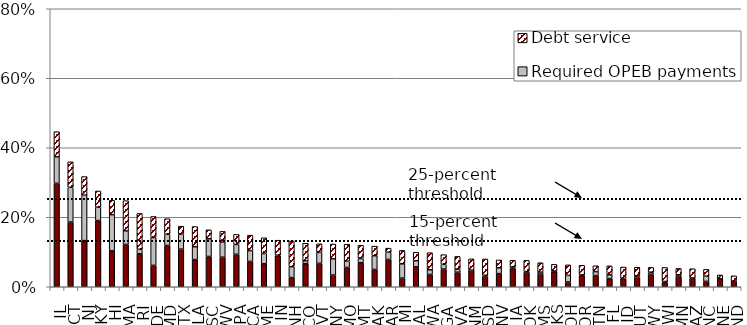
| Category | Required pension payments | Required OPEB payments | Debt service |
|---|---|---|---|
| IL | 0.298 | 0.076 | 0.073 |
| CT | 0.186 | 0.1 | 0.074 |
| NJ | 0.133 | 0.131 | 0.054 |
| KY | 0.19 | 0.039 | 0.047 |
| HI | 0.104 | 0.104 | 0.041 |
| MA | 0.122 | 0.039 | 0.087 |
| RI | 0.095 | 0.013 | 0.103 |
| DE | 0.062 | 0.08 | 0.061 |
| MD | 0.119 | 0.032 | 0.045 |
| TX | 0.108 | 0.043 | 0.023 |
| LA | 0.078 | 0.037 | 0.058 |
| SC | 0.087 | 0.051 | 0.026 |
| WV | 0.085 | 0.043 | 0.031 |
| PA | 0.093 | 0.028 | 0.029 |
| CA | 0.073 | 0.031 | 0.044 |
| ME | 0.066 | 0.03 | 0.045 |
| IN | 0.089 | 0.001 | 0.043 |
| NH | 0.027 | 0.031 | 0.074 |
| CO | 0.066 | 0.008 | 0.051 |
| VT | 0.067 | 0.031 | 0.025 |
| NY | 0.034 | 0.047 | 0.042 |
| MO | 0.056 | 0.018 | 0.049 |
| MT | 0.069 | 0.012 | 0.038 |
| AK | 0.05 | 0.04 | 0.028 |
| AR | 0.079 | 0.021 | 0.012 |
| MI | 0.025 | 0.041 | 0.039 |
| AL | 0.057 | 0.018 | 0.024 |
| WA | 0.035 | 0.013 | 0.049 |
| GA | 0.051 | 0.014 | 0.028 |
| VA | 0.042 | 0.009 | 0.036 |
| NM | 0.048 | 0 | 0.032 |
| SD | 0.03 | 0.003 | 0.047 |
| NV | 0.038 | 0.017 | 0.023 |
| IA | 0.052 | 0.005 | 0.019 |
| OK | 0.042 | 0.001 | 0.032 |
| MS | 0.037 | 0.005 | 0.027 |
| KS | 0.043 | 0.002 | 0.019 |
| OH | 0.014 | 0.019 | 0.03 |
| OR | 0.032 | 0.002 | 0.028 |
| TN | 0.032 | 0.011 | 0.017 |
| FL | 0.024 | 0.011 | 0.026 |
| ID | 0.023 | 0.001 | 0.033 |
| UT | 0.028 | 0.003 | 0.025 |
| WY | 0.036 | 0.006 | 0.014 |
| WI | 0.012 | 0.003 | 0.04 |
| MN | 0.03 | 0.004 | 0.018 |
| AZ | 0.024 | 0.001 | 0.027 |
| NC | 0.015 | 0.015 | 0.019 |
| NE | 0.023 | 0 | 0.011 |
| ND | 0.016 | 0 | 0.015 |